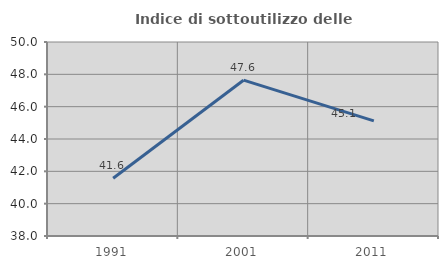
| Category | Indice di sottoutilizzo delle abitazioni  |
|---|---|
| 1991.0 | 41.57 |
| 2001.0 | 47.638 |
| 2011.0 | 45.119 |